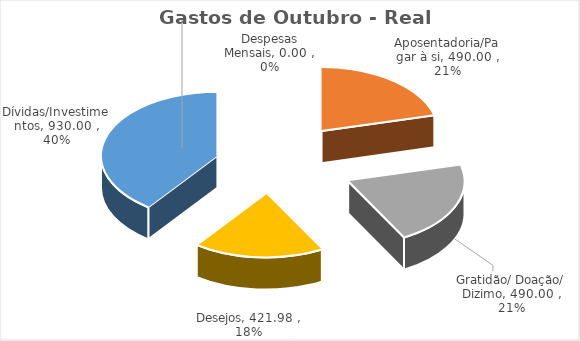
| Category | Gastos de Outubro - Real Acumulado |
|---|---|
| Despesas Mensais | 0 |
| Aposentadoria/Pagar à si | 490 |
| Gratidão/ Doação/ Dizimo | 490 |
| Desejos | 421.98 |
| Dívidas/Investimentos | 930 |